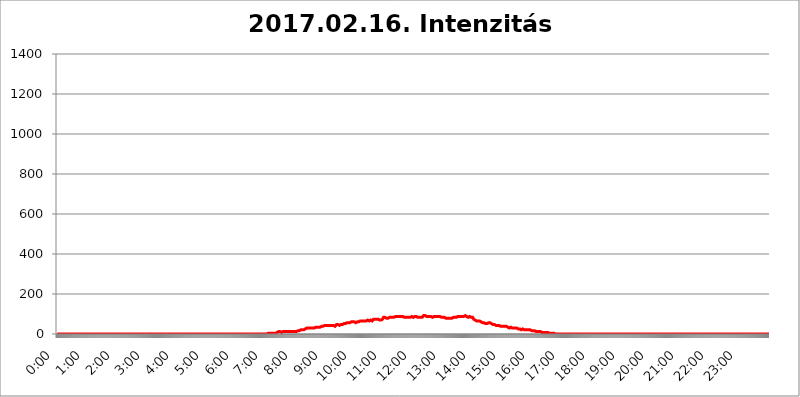
| Category | 2017.02.16. Intenzitás [W/m^2] |
|---|---|
| 0.0 | 0 |
| 0.0006944444444444445 | 0 |
| 0.001388888888888889 | 0 |
| 0.0020833333333333333 | 0 |
| 0.002777777777777778 | 0 |
| 0.003472222222222222 | 0 |
| 0.004166666666666667 | 0 |
| 0.004861111111111111 | 0 |
| 0.005555555555555556 | 0 |
| 0.0062499999999999995 | 0 |
| 0.006944444444444444 | 0 |
| 0.007638888888888889 | 0 |
| 0.008333333333333333 | 0 |
| 0.009027777777777779 | 0 |
| 0.009722222222222222 | 0 |
| 0.010416666666666666 | 0 |
| 0.011111111111111112 | 0 |
| 0.011805555555555555 | 0 |
| 0.012499999999999999 | 0 |
| 0.013194444444444444 | 0 |
| 0.013888888888888888 | 0 |
| 0.014583333333333332 | 0 |
| 0.015277777777777777 | 0 |
| 0.015972222222222224 | 0 |
| 0.016666666666666666 | 0 |
| 0.017361111111111112 | 0 |
| 0.018055555555555557 | 0 |
| 0.01875 | 0 |
| 0.019444444444444445 | 0 |
| 0.02013888888888889 | 0 |
| 0.020833333333333332 | 0 |
| 0.02152777777777778 | 0 |
| 0.022222222222222223 | 0 |
| 0.02291666666666667 | 0 |
| 0.02361111111111111 | 0 |
| 0.024305555555555556 | 0 |
| 0.024999999999999998 | 0 |
| 0.025694444444444447 | 0 |
| 0.02638888888888889 | 0 |
| 0.027083333333333334 | 0 |
| 0.027777777777777776 | 0 |
| 0.02847222222222222 | 0 |
| 0.029166666666666664 | 0 |
| 0.029861111111111113 | 0 |
| 0.030555555555555555 | 0 |
| 0.03125 | 0 |
| 0.03194444444444445 | 0 |
| 0.03263888888888889 | 0 |
| 0.03333333333333333 | 0 |
| 0.034027777777777775 | 0 |
| 0.034722222222222224 | 0 |
| 0.035416666666666666 | 0 |
| 0.036111111111111115 | 0 |
| 0.03680555555555556 | 0 |
| 0.0375 | 0 |
| 0.03819444444444444 | 0 |
| 0.03888888888888889 | 0 |
| 0.03958333333333333 | 0 |
| 0.04027777777777778 | 0 |
| 0.04097222222222222 | 0 |
| 0.041666666666666664 | 0 |
| 0.042361111111111106 | 0 |
| 0.04305555555555556 | 0 |
| 0.043750000000000004 | 0 |
| 0.044444444444444446 | 0 |
| 0.04513888888888889 | 0 |
| 0.04583333333333334 | 0 |
| 0.04652777777777778 | 0 |
| 0.04722222222222222 | 0 |
| 0.04791666666666666 | 0 |
| 0.04861111111111111 | 0 |
| 0.049305555555555554 | 0 |
| 0.049999999999999996 | 0 |
| 0.05069444444444445 | 0 |
| 0.051388888888888894 | 0 |
| 0.052083333333333336 | 0 |
| 0.05277777777777778 | 0 |
| 0.05347222222222222 | 0 |
| 0.05416666666666667 | 0 |
| 0.05486111111111111 | 0 |
| 0.05555555555555555 | 0 |
| 0.05625 | 0 |
| 0.05694444444444444 | 0 |
| 0.057638888888888885 | 0 |
| 0.05833333333333333 | 0 |
| 0.05902777777777778 | 0 |
| 0.059722222222222225 | 0 |
| 0.06041666666666667 | 0 |
| 0.061111111111111116 | 0 |
| 0.06180555555555556 | 0 |
| 0.0625 | 0 |
| 0.06319444444444444 | 0 |
| 0.06388888888888888 | 0 |
| 0.06458333333333334 | 0 |
| 0.06527777777777778 | 0 |
| 0.06597222222222222 | 0 |
| 0.06666666666666667 | 0 |
| 0.06736111111111111 | 0 |
| 0.06805555555555555 | 0 |
| 0.06874999999999999 | 0 |
| 0.06944444444444443 | 0 |
| 0.07013888888888889 | 0 |
| 0.07083333333333333 | 0 |
| 0.07152777777777779 | 0 |
| 0.07222222222222223 | 0 |
| 0.07291666666666667 | 0 |
| 0.07361111111111111 | 0 |
| 0.07430555555555556 | 0 |
| 0.075 | 0 |
| 0.07569444444444444 | 0 |
| 0.0763888888888889 | 0 |
| 0.07708333333333334 | 0 |
| 0.07777777777777778 | 0 |
| 0.07847222222222222 | 0 |
| 0.07916666666666666 | 0 |
| 0.0798611111111111 | 0 |
| 0.08055555555555556 | 0 |
| 0.08125 | 0 |
| 0.08194444444444444 | 0 |
| 0.08263888888888889 | 0 |
| 0.08333333333333333 | 0 |
| 0.08402777777777777 | 0 |
| 0.08472222222222221 | 0 |
| 0.08541666666666665 | 0 |
| 0.08611111111111112 | 0 |
| 0.08680555555555557 | 0 |
| 0.08750000000000001 | 0 |
| 0.08819444444444445 | 0 |
| 0.08888888888888889 | 0 |
| 0.08958333333333333 | 0 |
| 0.09027777777777778 | 0 |
| 0.09097222222222222 | 0 |
| 0.09166666666666667 | 0 |
| 0.09236111111111112 | 0 |
| 0.09305555555555556 | 0 |
| 0.09375 | 0 |
| 0.09444444444444444 | 0 |
| 0.09513888888888888 | 0 |
| 0.09583333333333333 | 0 |
| 0.09652777777777777 | 0 |
| 0.09722222222222222 | 0 |
| 0.09791666666666667 | 0 |
| 0.09861111111111111 | 0 |
| 0.09930555555555555 | 0 |
| 0.09999999999999999 | 0 |
| 0.10069444444444443 | 0 |
| 0.1013888888888889 | 0 |
| 0.10208333333333335 | 0 |
| 0.10277777777777779 | 0 |
| 0.10347222222222223 | 0 |
| 0.10416666666666667 | 0 |
| 0.10486111111111111 | 0 |
| 0.10555555555555556 | 0 |
| 0.10625 | 0 |
| 0.10694444444444444 | 0 |
| 0.1076388888888889 | 0 |
| 0.10833333333333334 | 0 |
| 0.10902777777777778 | 0 |
| 0.10972222222222222 | 0 |
| 0.1111111111111111 | 0 |
| 0.11180555555555556 | 0 |
| 0.11180555555555556 | 0 |
| 0.1125 | 0 |
| 0.11319444444444444 | 0 |
| 0.11388888888888889 | 0 |
| 0.11458333333333333 | 0 |
| 0.11527777777777777 | 0 |
| 0.11597222222222221 | 0 |
| 0.11666666666666665 | 0 |
| 0.1173611111111111 | 0 |
| 0.11805555555555557 | 0 |
| 0.11944444444444445 | 0 |
| 0.12013888888888889 | 0 |
| 0.12083333333333333 | 0 |
| 0.12152777777777778 | 0 |
| 0.12222222222222223 | 0 |
| 0.12291666666666667 | 0 |
| 0.12291666666666667 | 0 |
| 0.12361111111111112 | 0 |
| 0.12430555555555556 | 0 |
| 0.125 | 0 |
| 0.12569444444444444 | 0 |
| 0.12638888888888888 | 0 |
| 0.12708333333333333 | 0 |
| 0.16875 | 0 |
| 0.12847222222222224 | 0 |
| 0.12916666666666668 | 0 |
| 0.12986111111111112 | 0 |
| 0.13055555555555556 | 0 |
| 0.13125 | 0 |
| 0.13194444444444445 | 0 |
| 0.1326388888888889 | 0 |
| 0.13333333333333333 | 0 |
| 0.13402777777777777 | 0 |
| 0.13402777777777777 | 0 |
| 0.13472222222222222 | 0 |
| 0.13541666666666666 | 0 |
| 0.1361111111111111 | 0 |
| 0.13749999999999998 | 0 |
| 0.13819444444444443 | 0 |
| 0.1388888888888889 | 0 |
| 0.13958333333333334 | 0 |
| 0.14027777777777778 | 0 |
| 0.14097222222222222 | 0 |
| 0.14166666666666666 | 0 |
| 0.1423611111111111 | 0 |
| 0.14305555555555557 | 0 |
| 0.14375000000000002 | 0 |
| 0.14444444444444446 | 0 |
| 0.1451388888888889 | 0 |
| 0.1451388888888889 | 0 |
| 0.14652777777777778 | 0 |
| 0.14722222222222223 | 0 |
| 0.14791666666666667 | 0 |
| 0.1486111111111111 | 0 |
| 0.14930555555555555 | 0 |
| 0.15 | 0 |
| 0.15069444444444444 | 0 |
| 0.15138888888888888 | 0 |
| 0.15208333333333332 | 0 |
| 0.15277777777777776 | 0 |
| 0.15347222222222223 | 0 |
| 0.15416666666666667 | 0 |
| 0.15486111111111112 | 0 |
| 0.15555555555555556 | 0 |
| 0.15625 | 0 |
| 0.15694444444444444 | 0 |
| 0.15763888888888888 | 0 |
| 0.15833333333333333 | 0 |
| 0.15902777777777777 | 0 |
| 0.15972222222222224 | 0 |
| 0.16041666666666668 | 0 |
| 0.16111111111111112 | 0 |
| 0.16180555555555556 | 0 |
| 0.1625 | 0 |
| 0.16319444444444445 | 0 |
| 0.1638888888888889 | 0 |
| 0.16458333333333333 | 0 |
| 0.16527777777777777 | 0 |
| 0.16597222222222222 | 0 |
| 0.16666666666666666 | 0 |
| 0.1673611111111111 | 0 |
| 0.16805555555555554 | 0 |
| 0.16874999999999998 | 0 |
| 0.16944444444444443 | 0 |
| 0.17013888888888887 | 0 |
| 0.1708333333333333 | 0 |
| 0.17152777777777775 | 0 |
| 0.17222222222222225 | 0 |
| 0.1729166666666667 | 0 |
| 0.17361111111111113 | 0 |
| 0.17430555555555557 | 0 |
| 0.17500000000000002 | 0 |
| 0.17569444444444446 | 0 |
| 0.1763888888888889 | 0 |
| 0.17708333333333334 | 0 |
| 0.17777777777777778 | 0 |
| 0.17847222222222223 | 0 |
| 0.17916666666666667 | 0 |
| 0.1798611111111111 | 0 |
| 0.18055555555555555 | 0 |
| 0.18125 | 0 |
| 0.18194444444444444 | 0 |
| 0.1826388888888889 | 0 |
| 0.18333333333333335 | 0 |
| 0.1840277777777778 | 0 |
| 0.18472222222222223 | 0 |
| 0.18541666666666667 | 0 |
| 0.18611111111111112 | 0 |
| 0.18680555555555556 | 0 |
| 0.1875 | 0 |
| 0.18819444444444444 | 0 |
| 0.18888888888888888 | 0 |
| 0.18958333333333333 | 0 |
| 0.19027777777777777 | 0 |
| 0.1909722222222222 | 0 |
| 0.19166666666666665 | 0 |
| 0.19236111111111112 | 0 |
| 0.19305555555555554 | 0 |
| 0.19375 | 0 |
| 0.19444444444444445 | 0 |
| 0.1951388888888889 | 0 |
| 0.19583333333333333 | 0 |
| 0.19652777777777777 | 0 |
| 0.19722222222222222 | 0 |
| 0.19791666666666666 | 0 |
| 0.1986111111111111 | 0 |
| 0.19930555555555554 | 0 |
| 0.19999999999999998 | 0 |
| 0.20069444444444443 | 0 |
| 0.20138888888888887 | 0 |
| 0.2020833333333333 | 0 |
| 0.2027777777777778 | 0 |
| 0.2034722222222222 | 0 |
| 0.2041666666666667 | 0 |
| 0.20486111111111113 | 0 |
| 0.20555555555555557 | 0 |
| 0.20625000000000002 | 0 |
| 0.20694444444444446 | 0 |
| 0.2076388888888889 | 0 |
| 0.20833333333333334 | 0 |
| 0.20902777777777778 | 0 |
| 0.20972222222222223 | 0 |
| 0.21041666666666667 | 0 |
| 0.2111111111111111 | 0 |
| 0.21180555555555555 | 0 |
| 0.2125 | 0 |
| 0.21319444444444444 | 0 |
| 0.2138888888888889 | 0 |
| 0.21458333333333335 | 0 |
| 0.2152777777777778 | 0 |
| 0.21597222222222223 | 0 |
| 0.21666666666666667 | 0 |
| 0.21736111111111112 | 0 |
| 0.21805555555555556 | 0 |
| 0.21875 | 0 |
| 0.21944444444444444 | 0 |
| 0.22013888888888888 | 0 |
| 0.22083333333333333 | 0 |
| 0.22152777777777777 | 0 |
| 0.2222222222222222 | 0 |
| 0.22291666666666665 | 0 |
| 0.2236111111111111 | 0 |
| 0.22430555555555556 | 0 |
| 0.225 | 0 |
| 0.22569444444444445 | 0 |
| 0.2263888888888889 | 0 |
| 0.22708333333333333 | 0 |
| 0.22777777777777777 | 0 |
| 0.22847222222222222 | 0 |
| 0.22916666666666666 | 0 |
| 0.2298611111111111 | 0 |
| 0.23055555555555554 | 0 |
| 0.23124999999999998 | 0 |
| 0.23194444444444443 | 0 |
| 0.23263888888888887 | 0 |
| 0.2333333333333333 | 0 |
| 0.2340277777777778 | 0 |
| 0.2347222222222222 | 0 |
| 0.2354166666666667 | 0 |
| 0.23611111111111113 | 0 |
| 0.23680555555555557 | 0 |
| 0.23750000000000002 | 0 |
| 0.23819444444444446 | 0 |
| 0.2388888888888889 | 0 |
| 0.23958333333333334 | 0 |
| 0.24027777777777778 | 0 |
| 0.24097222222222223 | 0 |
| 0.24166666666666667 | 0 |
| 0.2423611111111111 | 0 |
| 0.24305555555555555 | 0 |
| 0.24375 | 0 |
| 0.24444444444444446 | 0 |
| 0.24513888888888888 | 0 |
| 0.24583333333333335 | 0 |
| 0.2465277777777778 | 0 |
| 0.24722222222222223 | 0 |
| 0.24791666666666667 | 0 |
| 0.24861111111111112 | 0 |
| 0.24930555555555556 | 0 |
| 0.25 | 0 |
| 0.25069444444444444 | 0 |
| 0.2513888888888889 | 0 |
| 0.2520833333333333 | 0 |
| 0.25277777777777777 | 0 |
| 0.2534722222222222 | 0 |
| 0.25416666666666665 | 0 |
| 0.2548611111111111 | 0 |
| 0.2555555555555556 | 0 |
| 0.25625000000000003 | 0 |
| 0.2569444444444445 | 0 |
| 0.2576388888888889 | 0 |
| 0.25833333333333336 | 0 |
| 0.2590277777777778 | 0 |
| 0.25972222222222224 | 0 |
| 0.2604166666666667 | 0 |
| 0.2611111111111111 | 0 |
| 0.26180555555555557 | 0 |
| 0.2625 | 0 |
| 0.26319444444444445 | 0 |
| 0.2638888888888889 | 0 |
| 0.26458333333333334 | 0 |
| 0.2652777777777778 | 0 |
| 0.2659722222222222 | 0 |
| 0.26666666666666666 | 0 |
| 0.2673611111111111 | 0 |
| 0.26805555555555555 | 0 |
| 0.26875 | 0 |
| 0.26944444444444443 | 0 |
| 0.2701388888888889 | 0 |
| 0.2708333333333333 | 0 |
| 0.27152777777777776 | 0 |
| 0.2722222222222222 | 0 |
| 0.27291666666666664 | 0 |
| 0.2736111111111111 | 0 |
| 0.2743055555555555 | 0 |
| 0.27499999999999997 | 0 |
| 0.27569444444444446 | 0 |
| 0.27638888888888885 | 0 |
| 0.27708333333333335 | 0 |
| 0.2777777777777778 | 0 |
| 0.27847222222222223 | 0 |
| 0.2791666666666667 | 0 |
| 0.2798611111111111 | 0 |
| 0.28055555555555556 | 0 |
| 0.28125 | 0 |
| 0.28194444444444444 | 0 |
| 0.2826388888888889 | 0 |
| 0.2833333333333333 | 0 |
| 0.28402777777777777 | 0 |
| 0.2847222222222222 | 0 |
| 0.28541666666666665 | 0 |
| 0.28611111111111115 | 0 |
| 0.28680555555555554 | 0 |
| 0.28750000000000003 | 0 |
| 0.2881944444444445 | 0 |
| 0.2888888888888889 | 0 |
| 0.28958333333333336 | 0 |
| 0.2902777777777778 | 0 |
| 0.29097222222222224 | 0 |
| 0.2916666666666667 | 0 |
| 0.2923611111111111 | 0 |
| 0.29305555555555557 | 0 |
| 0.29375 | 0 |
| 0.29444444444444445 | 0 |
| 0.2951388888888889 | 3.525 |
| 0.29583333333333334 | 3.525 |
| 0.2965277777777778 | 3.525 |
| 0.2972222222222222 | 3.525 |
| 0.29791666666666666 | 3.525 |
| 0.2986111111111111 | 3.525 |
| 0.29930555555555555 | 3.525 |
| 0.3 | 3.525 |
| 0.30069444444444443 | 3.525 |
| 0.3013888888888889 | 3.525 |
| 0.3020833333333333 | 3.525 |
| 0.30277777777777776 | 3.525 |
| 0.3034722222222222 | 3.525 |
| 0.30416666666666664 | 3.525 |
| 0.3048611111111111 | 3.525 |
| 0.3055555555555555 | 3.525 |
| 0.30624999999999997 | 3.525 |
| 0.3069444444444444 | 3.525 |
| 0.3076388888888889 | 3.525 |
| 0.30833333333333335 | 7.887 |
| 0.3090277777777778 | 7.887 |
| 0.30972222222222223 | 7.887 |
| 0.3104166666666667 | 12.257 |
| 0.3111111111111111 | 12.257 |
| 0.31180555555555556 | 12.257 |
| 0.3125 | 12.257 |
| 0.31319444444444444 | 12.257 |
| 0.3138888888888889 | 7.887 |
| 0.3145833333333333 | 7.887 |
| 0.31527777777777777 | 12.257 |
| 0.3159722222222222 | 12.257 |
| 0.31666666666666665 | 12.257 |
| 0.31736111111111115 | 12.257 |
| 0.31805555555555554 | 12.257 |
| 0.31875000000000003 | 12.257 |
| 0.3194444444444445 | 12.257 |
| 0.3201388888888889 | 12.257 |
| 0.32083333333333336 | 12.257 |
| 0.3215277777777778 | 12.257 |
| 0.32222222222222224 | 12.257 |
| 0.3229166666666667 | 12.257 |
| 0.3236111111111111 | 12.257 |
| 0.32430555555555557 | 12.257 |
| 0.325 | 12.257 |
| 0.32569444444444445 | 12.257 |
| 0.3263888888888889 | 12.257 |
| 0.32708333333333334 | 12.257 |
| 0.3277777777777778 | 12.257 |
| 0.3284722222222222 | 12.257 |
| 0.32916666666666666 | 12.257 |
| 0.3298611111111111 | 12.257 |
| 0.33055555555555555 | 12.257 |
| 0.33125 | 12.257 |
| 0.33194444444444443 | 12.257 |
| 0.3326388888888889 | 12.257 |
| 0.3333333333333333 | 12.257 |
| 0.3340277777777778 | 12.257 |
| 0.3347222222222222 | 12.257 |
| 0.3354166666666667 | 12.257 |
| 0.3361111111111111 | 16.636 |
| 0.3368055555555556 | 16.636 |
| 0.33749999999999997 | 16.636 |
| 0.33819444444444446 | 16.636 |
| 0.33888888888888885 | 16.636 |
| 0.33958333333333335 | 16.636 |
| 0.34027777777777773 | 16.636 |
| 0.34097222222222223 | 21.024 |
| 0.3416666666666666 | 21.024 |
| 0.3423611111111111 | 21.024 |
| 0.3430555555555555 | 21.024 |
| 0.34375 | 21.024 |
| 0.3444444444444445 | 21.024 |
| 0.3451388888888889 | 21.024 |
| 0.3458333333333334 | 21.024 |
| 0.34652777777777777 | 21.024 |
| 0.34722222222222227 | 21.024 |
| 0.34791666666666665 | 25.419 |
| 0.34861111111111115 | 25.419 |
| 0.34930555555555554 | 25.419 |
| 0.35000000000000003 | 29.823 |
| 0.3506944444444444 | 29.823 |
| 0.3513888888888889 | 29.823 |
| 0.3520833333333333 | 29.823 |
| 0.3527777777777778 | 29.823 |
| 0.3534722222222222 | 29.823 |
| 0.3541666666666667 | 29.823 |
| 0.3548611111111111 | 29.823 |
| 0.35555555555555557 | 29.823 |
| 0.35625 | 29.823 |
| 0.35694444444444445 | 29.823 |
| 0.3576388888888889 | 29.823 |
| 0.35833333333333334 | 29.823 |
| 0.3590277777777778 | 29.823 |
| 0.3597222222222222 | 29.823 |
| 0.36041666666666666 | 29.823 |
| 0.3611111111111111 | 29.823 |
| 0.36180555555555555 | 29.823 |
| 0.3625 | 34.234 |
| 0.36319444444444443 | 29.823 |
| 0.3638888888888889 | 34.234 |
| 0.3645833333333333 | 34.234 |
| 0.3652777777777778 | 34.234 |
| 0.3659722222222222 | 34.234 |
| 0.3666666666666667 | 34.234 |
| 0.3673611111111111 | 34.234 |
| 0.3680555555555556 | 34.234 |
| 0.36874999999999997 | 34.234 |
| 0.36944444444444446 | 34.234 |
| 0.37013888888888885 | 38.653 |
| 0.37083333333333335 | 38.653 |
| 0.37152777777777773 | 38.653 |
| 0.37222222222222223 | 38.653 |
| 0.3729166666666666 | 38.653 |
| 0.3736111111111111 | 38.653 |
| 0.3743055555555555 | 38.653 |
| 0.375 | 43.079 |
| 0.3756944444444445 | 43.079 |
| 0.3763888888888889 | 38.653 |
| 0.3770833333333334 | 43.079 |
| 0.37777777777777777 | 43.079 |
| 0.37847222222222227 | 43.079 |
| 0.37916666666666665 | 43.079 |
| 0.37986111111111115 | 43.079 |
| 0.38055555555555554 | 43.079 |
| 0.38125000000000003 | 43.079 |
| 0.3819444444444444 | 43.079 |
| 0.3826388888888889 | 43.079 |
| 0.3833333333333333 | 43.079 |
| 0.3840277777777778 | 43.079 |
| 0.3847222222222222 | 43.079 |
| 0.3854166666666667 | 43.079 |
| 0.3861111111111111 | 43.079 |
| 0.38680555555555557 | 43.079 |
| 0.3875 | 43.079 |
| 0.38819444444444445 | 43.079 |
| 0.3888888888888889 | 38.653 |
| 0.38958333333333334 | 38.653 |
| 0.3902777777777778 | 38.653 |
| 0.3909722222222222 | 43.079 |
| 0.39166666666666666 | 47.511 |
| 0.3923611111111111 | 43.079 |
| 0.39305555555555555 | 43.079 |
| 0.39375 | 47.511 |
| 0.39444444444444443 | 47.511 |
| 0.3951388888888889 | 47.511 |
| 0.3958333333333333 | 43.079 |
| 0.3965277777777778 | 43.079 |
| 0.3972222222222222 | 47.511 |
| 0.3979166666666667 | 47.511 |
| 0.3986111111111111 | 47.511 |
| 0.3993055555555556 | 47.511 |
| 0.39999999999999997 | 47.511 |
| 0.40069444444444446 | 47.511 |
| 0.40138888888888885 | 47.511 |
| 0.40208333333333335 | 51.951 |
| 0.40277777777777773 | 51.951 |
| 0.40347222222222223 | 51.951 |
| 0.4041666666666666 | 51.951 |
| 0.4048611111111111 | 56.398 |
| 0.4055555555555555 | 56.398 |
| 0.40625 | 56.398 |
| 0.4069444444444445 | 56.398 |
| 0.4076388888888889 | 56.398 |
| 0.4083333333333334 | 56.398 |
| 0.40902777777777777 | 56.398 |
| 0.40972222222222227 | 56.398 |
| 0.41041666666666665 | 56.398 |
| 0.41111111111111115 | 60.85 |
| 0.41180555555555554 | 60.85 |
| 0.41250000000000003 | 60.85 |
| 0.4131944444444444 | 60.85 |
| 0.4138888888888889 | 65.31 |
| 0.4145833333333333 | 60.85 |
| 0.4152777777777778 | 60.85 |
| 0.4159722222222222 | 60.85 |
| 0.4166666666666667 | 60.85 |
| 0.4173611111111111 | 60.85 |
| 0.41805555555555557 | 60.85 |
| 0.41875 | 56.398 |
| 0.41944444444444445 | 60.85 |
| 0.4201388888888889 | 60.85 |
| 0.42083333333333334 | 60.85 |
| 0.4215277777777778 | 65.31 |
| 0.4222222222222222 | 65.31 |
| 0.42291666666666666 | 60.85 |
| 0.4236111111111111 | 65.31 |
| 0.42430555555555555 | 65.31 |
| 0.425 | 65.31 |
| 0.42569444444444443 | 65.31 |
| 0.4263888888888889 | 60.85 |
| 0.4270833333333333 | 65.31 |
| 0.4277777777777778 | 65.31 |
| 0.4284722222222222 | 65.31 |
| 0.4291666666666667 | 65.31 |
| 0.4298611111111111 | 65.31 |
| 0.4305555555555556 | 65.31 |
| 0.43124999999999997 | 65.31 |
| 0.43194444444444446 | 65.31 |
| 0.43263888888888885 | 65.31 |
| 0.43333333333333335 | 65.31 |
| 0.43402777777777773 | 65.31 |
| 0.43472222222222223 | 69.775 |
| 0.4354166666666666 | 69.775 |
| 0.4361111111111111 | 69.775 |
| 0.4368055555555555 | 69.775 |
| 0.4375 | 65.31 |
| 0.4381944444444445 | 69.775 |
| 0.4388888888888889 | 69.775 |
| 0.4395833333333334 | 69.775 |
| 0.44027777777777777 | 65.31 |
| 0.44097222222222227 | 65.31 |
| 0.44166666666666665 | 65.31 |
| 0.44236111111111115 | 69.775 |
| 0.44305555555555554 | 69.775 |
| 0.44375000000000003 | 74.246 |
| 0.4444444444444444 | 74.246 |
| 0.4451388888888889 | 74.246 |
| 0.4458333333333333 | 74.246 |
| 0.4465277777777778 | 78.722 |
| 0.4472222222222222 | 78.722 |
| 0.4479166666666667 | 74.246 |
| 0.4486111111111111 | 74.246 |
| 0.44930555555555557 | 74.246 |
| 0.45 | 74.246 |
| 0.45069444444444445 | 74.246 |
| 0.4513888888888889 | 69.775 |
| 0.45208333333333334 | 69.775 |
| 0.4527777777777778 | 69.775 |
| 0.4534722222222222 | 69.775 |
| 0.45416666666666666 | 69.775 |
| 0.4548611111111111 | 74.246 |
| 0.45555555555555555 | 74.246 |
| 0.45625 | 74.246 |
| 0.45694444444444443 | 78.722 |
| 0.4576388888888889 | 83.205 |
| 0.4583333333333333 | 83.205 |
| 0.4590277777777778 | 83.205 |
| 0.4597222222222222 | 83.205 |
| 0.4604166666666667 | 78.722 |
| 0.4611111111111111 | 78.722 |
| 0.4618055555555556 | 78.722 |
| 0.46249999999999997 | 78.722 |
| 0.46319444444444446 | 78.722 |
| 0.46388888888888885 | 78.722 |
| 0.46458333333333335 | 78.722 |
| 0.46527777777777773 | 83.205 |
| 0.46597222222222223 | 83.205 |
| 0.4666666666666666 | 83.205 |
| 0.4673611111111111 | 83.205 |
| 0.4680555555555555 | 83.205 |
| 0.46875 | 83.205 |
| 0.4694444444444445 | 83.205 |
| 0.4701388888888889 | 83.205 |
| 0.4708333333333334 | 83.205 |
| 0.47152777777777777 | 83.205 |
| 0.47222222222222227 | 83.205 |
| 0.47291666666666665 | 83.205 |
| 0.47361111111111115 | 87.692 |
| 0.47430555555555554 | 87.692 |
| 0.47500000000000003 | 87.692 |
| 0.4756944444444444 | 87.692 |
| 0.4763888888888889 | 87.692 |
| 0.4770833333333333 | 87.692 |
| 0.4777777777777778 | 87.692 |
| 0.4784722222222222 | 87.692 |
| 0.4791666666666667 | 92.184 |
| 0.4798611111111111 | 87.692 |
| 0.48055555555555557 | 87.692 |
| 0.48125 | 87.692 |
| 0.48194444444444445 | 87.692 |
| 0.4826388888888889 | 87.692 |
| 0.48333333333333334 | 87.692 |
| 0.4840277777777778 | 87.692 |
| 0.4847222222222222 | 87.692 |
| 0.48541666666666666 | 87.692 |
| 0.4861111111111111 | 87.692 |
| 0.48680555555555555 | 83.205 |
| 0.4875 | 87.692 |
| 0.48819444444444443 | 83.205 |
| 0.4888888888888889 | 83.205 |
| 0.4895833333333333 | 83.205 |
| 0.4902777777777778 | 83.205 |
| 0.4909722222222222 | 83.205 |
| 0.4916666666666667 | 83.205 |
| 0.4923611111111111 | 83.205 |
| 0.4930555555555556 | 83.205 |
| 0.49374999999999997 | 83.205 |
| 0.49444444444444446 | 83.205 |
| 0.49513888888888885 | 83.205 |
| 0.49583333333333335 | 83.205 |
| 0.49652777777777773 | 83.205 |
| 0.49722222222222223 | 87.692 |
| 0.4979166666666666 | 87.692 |
| 0.4986111111111111 | 87.692 |
| 0.4993055555555555 | 83.205 |
| 0.5 | 83.205 |
| 0.5006944444444444 | 87.692 |
| 0.5013888888888889 | 87.692 |
| 0.5020833333333333 | 83.205 |
| 0.5027777777777778 | 83.205 |
| 0.5034722222222222 | 87.692 |
| 0.5041666666666667 | 87.692 |
| 0.5048611111111111 | 83.205 |
| 0.5055555555555555 | 83.205 |
| 0.50625 | 83.205 |
| 0.5069444444444444 | 87.692 |
| 0.5076388888888889 | 83.205 |
| 0.5083333333333333 | 83.205 |
| 0.5090277777777777 | 83.205 |
| 0.5097222222222222 | 83.205 |
| 0.5104166666666666 | 83.205 |
| 0.5111111111111112 | 83.205 |
| 0.5118055555555555 | 83.205 |
| 0.5125000000000001 | 87.692 |
| 0.5131944444444444 | 87.692 |
| 0.513888888888889 | 92.184 |
| 0.5145833333333333 | 87.692 |
| 0.5152777777777778 | 92.184 |
| 0.5159722222222222 | 92.184 |
| 0.5166666666666667 | 92.184 |
| 0.517361111111111 | 87.692 |
| 0.5180555555555556 | 87.692 |
| 0.5187499999999999 | 92.184 |
| 0.5194444444444445 | 92.184 |
| 0.5201388888888888 | 87.692 |
| 0.5208333333333334 | 87.692 |
| 0.5215277777777778 | 87.692 |
| 0.5222222222222223 | 87.692 |
| 0.5229166666666667 | 87.692 |
| 0.5236111111111111 | 87.692 |
| 0.5243055555555556 | 87.692 |
| 0.525 | 87.692 |
| 0.5256944444444445 | 87.692 |
| 0.5263888888888889 | 83.205 |
| 0.5270833333333333 | 87.692 |
| 0.5277777777777778 | 87.692 |
| 0.5284722222222222 | 87.692 |
| 0.5291666666666667 | 83.205 |
| 0.5298611111111111 | 83.205 |
| 0.5305555555555556 | 87.692 |
| 0.53125 | 87.692 |
| 0.5319444444444444 | 87.692 |
| 0.5326388888888889 | 87.692 |
| 0.5333333333333333 | 87.692 |
| 0.5340277777777778 | 87.692 |
| 0.5347222222222222 | 87.692 |
| 0.5354166666666667 | 87.692 |
| 0.5361111111111111 | 87.692 |
| 0.5368055555555555 | 87.692 |
| 0.5375 | 83.205 |
| 0.5381944444444444 | 83.205 |
| 0.5388888888888889 | 83.205 |
| 0.5395833333333333 | 83.205 |
| 0.5402777777777777 | 83.205 |
| 0.5409722222222222 | 83.205 |
| 0.5416666666666666 | 83.205 |
| 0.5423611111111112 | 83.205 |
| 0.5430555555555555 | 83.205 |
| 0.5437500000000001 | 83.205 |
| 0.5444444444444444 | 83.205 |
| 0.545138888888889 | 78.722 |
| 0.5458333333333333 | 83.205 |
| 0.5465277777777778 | 78.722 |
| 0.5472222222222222 | 78.722 |
| 0.5479166666666667 | 83.205 |
| 0.548611111111111 | 78.722 |
| 0.5493055555555556 | 78.722 |
| 0.5499999999999999 | 78.722 |
| 0.5506944444444445 | 78.722 |
| 0.5513888888888888 | 78.722 |
| 0.5520833333333334 | 78.722 |
| 0.5527777777777778 | 78.722 |
| 0.5534722222222223 | 78.722 |
| 0.5541666666666667 | 83.205 |
| 0.5548611111111111 | 83.205 |
| 0.5555555555555556 | 83.205 |
| 0.55625 | 83.205 |
| 0.5569444444444445 | 83.205 |
| 0.5576388888888889 | 83.205 |
| 0.5583333333333333 | 83.205 |
| 0.5590277777777778 | 87.692 |
| 0.5597222222222222 | 83.205 |
| 0.5604166666666667 | 83.205 |
| 0.5611111111111111 | 87.692 |
| 0.5618055555555556 | 87.692 |
| 0.5625 | 83.205 |
| 0.5631944444444444 | 83.205 |
| 0.5638888888888889 | 87.692 |
| 0.5645833333333333 | 87.692 |
| 0.5652777777777778 | 87.692 |
| 0.5659722222222222 | 87.692 |
| 0.5666666666666667 | 87.692 |
| 0.5673611111111111 | 87.692 |
| 0.5680555555555555 | 87.692 |
| 0.56875 | 87.692 |
| 0.5694444444444444 | 87.692 |
| 0.5701388888888889 | 87.692 |
| 0.5708333333333333 | 87.692 |
| 0.5715277777777777 | 87.692 |
| 0.5722222222222222 | 92.184 |
| 0.5729166666666666 | 87.692 |
| 0.5736111111111112 | 87.692 |
| 0.5743055555555555 | 87.692 |
| 0.5750000000000001 | 87.692 |
| 0.5756944444444444 | 87.692 |
| 0.576388888888889 | 83.205 |
| 0.5770833333333333 | 83.205 |
| 0.5777777777777778 | 87.692 |
| 0.5784722222222222 | 87.692 |
| 0.5791666666666667 | 87.692 |
| 0.579861111111111 | 83.205 |
| 0.5805555555555556 | 83.205 |
| 0.5812499999999999 | 83.205 |
| 0.5819444444444445 | 83.205 |
| 0.5826388888888888 | 83.205 |
| 0.5833333333333334 | 78.722 |
| 0.5840277777777778 | 74.246 |
| 0.5847222222222223 | 74.246 |
| 0.5854166666666667 | 74.246 |
| 0.5861111111111111 | 69.775 |
| 0.5868055555555556 | 69.775 |
| 0.5875 | 69.775 |
| 0.5881944444444445 | 65.31 |
| 0.5888888888888889 | 65.31 |
| 0.5895833333333333 | 65.31 |
| 0.5902777777777778 | 65.31 |
| 0.5909722222222222 | 65.31 |
| 0.5916666666666667 | 65.31 |
| 0.5923611111111111 | 65.31 |
| 0.5930555555555556 | 65.31 |
| 0.59375 | 60.85 |
| 0.5944444444444444 | 60.85 |
| 0.5951388888888889 | 65.31 |
| 0.5958333333333333 | 60.85 |
| 0.5965277777777778 | 56.398 |
| 0.5972222222222222 | 56.398 |
| 0.5979166666666667 | 56.398 |
| 0.5986111111111111 | 56.398 |
| 0.5993055555555555 | 56.398 |
| 0.6 | 51.951 |
| 0.6006944444444444 | 51.951 |
| 0.6013888888888889 | 51.951 |
| 0.6020833333333333 | 51.951 |
| 0.6027777777777777 | 51.951 |
| 0.6034722222222222 | 51.951 |
| 0.6041666666666666 | 51.951 |
| 0.6048611111111112 | 56.398 |
| 0.6055555555555555 | 56.398 |
| 0.6062500000000001 | 56.398 |
| 0.6069444444444444 | 56.398 |
| 0.607638888888889 | 56.398 |
| 0.6083333333333333 | 51.951 |
| 0.6090277777777778 | 51.951 |
| 0.6097222222222222 | 51.951 |
| 0.6104166666666667 | 47.511 |
| 0.611111111111111 | 47.511 |
| 0.6118055555555556 | 47.511 |
| 0.6124999999999999 | 47.511 |
| 0.6131944444444445 | 47.511 |
| 0.6138888888888888 | 47.511 |
| 0.6145833333333334 | 47.511 |
| 0.6152777777777778 | 43.079 |
| 0.6159722222222223 | 43.079 |
| 0.6166666666666667 | 43.079 |
| 0.6173611111111111 | 43.079 |
| 0.6180555555555556 | 43.079 |
| 0.61875 | 43.079 |
| 0.6194444444444445 | 43.079 |
| 0.6201388888888889 | 43.079 |
| 0.6208333333333333 | 38.653 |
| 0.6215277777777778 | 38.653 |
| 0.6222222222222222 | 38.653 |
| 0.6229166666666667 | 38.653 |
| 0.6236111111111111 | 38.653 |
| 0.6243055555555556 | 38.653 |
| 0.625 | 38.653 |
| 0.6256944444444444 | 38.653 |
| 0.6263888888888889 | 38.653 |
| 0.6270833333333333 | 38.653 |
| 0.6277777777777778 | 38.653 |
| 0.6284722222222222 | 38.653 |
| 0.6291666666666667 | 38.653 |
| 0.6298611111111111 | 38.653 |
| 0.6305555555555555 | 38.653 |
| 0.63125 | 34.234 |
| 0.6319444444444444 | 34.234 |
| 0.6326388888888889 | 29.823 |
| 0.6333333333333333 | 29.823 |
| 0.6340277777777777 | 29.823 |
| 0.6347222222222222 | 29.823 |
| 0.6354166666666666 | 34.234 |
| 0.6361111111111112 | 34.234 |
| 0.6368055555555555 | 34.234 |
| 0.6375000000000001 | 29.823 |
| 0.6381944444444444 | 29.823 |
| 0.638888888888889 | 29.823 |
| 0.6395833333333333 | 29.823 |
| 0.6402777777777778 | 29.823 |
| 0.6409722222222222 | 29.823 |
| 0.6416666666666667 | 29.823 |
| 0.642361111111111 | 29.823 |
| 0.6430555555555556 | 29.823 |
| 0.6437499999999999 | 29.823 |
| 0.6444444444444445 | 29.823 |
| 0.6451388888888888 | 29.823 |
| 0.6458333333333334 | 25.419 |
| 0.6465277777777778 | 25.419 |
| 0.6472222222222223 | 25.419 |
| 0.6479166666666667 | 25.419 |
| 0.6486111111111111 | 25.419 |
| 0.6493055555555556 | 25.419 |
| 0.65 | 25.419 |
| 0.6506944444444445 | 21.024 |
| 0.6513888888888889 | 25.419 |
| 0.6520833333333333 | 21.024 |
| 0.6527777777777778 | 25.419 |
| 0.6534722222222222 | 21.024 |
| 0.6541666666666667 | 21.024 |
| 0.6548611111111111 | 21.024 |
| 0.6555555555555556 | 21.024 |
| 0.65625 | 21.024 |
| 0.6569444444444444 | 21.024 |
| 0.6576388888888889 | 21.024 |
| 0.6583333333333333 | 21.024 |
| 0.6590277777777778 | 21.024 |
| 0.6597222222222222 | 21.024 |
| 0.6604166666666667 | 21.024 |
| 0.6611111111111111 | 21.024 |
| 0.6618055555555555 | 21.024 |
| 0.6625 | 21.024 |
| 0.6631944444444444 | 21.024 |
| 0.6638888888888889 | 21.024 |
| 0.6645833333333333 | 21.024 |
| 0.6652777777777777 | 16.636 |
| 0.6659722222222222 | 16.636 |
| 0.6666666666666666 | 16.636 |
| 0.6673611111111111 | 16.636 |
| 0.6680555555555556 | 16.636 |
| 0.6687500000000001 | 16.636 |
| 0.6694444444444444 | 16.636 |
| 0.6701388888888888 | 16.636 |
| 0.6708333333333334 | 16.636 |
| 0.6715277777777778 | 12.257 |
| 0.6722222222222222 | 12.257 |
| 0.6729166666666666 | 12.257 |
| 0.6736111111111112 | 12.257 |
| 0.6743055555555556 | 12.257 |
| 0.6749999999999999 | 12.257 |
| 0.6756944444444444 | 12.257 |
| 0.6763888888888889 | 12.257 |
| 0.6770833333333334 | 12.257 |
| 0.6777777777777777 | 12.257 |
| 0.6784722222222223 | 12.257 |
| 0.6791666666666667 | 12.257 |
| 0.6798611111111111 | 7.887 |
| 0.6805555555555555 | 7.887 |
| 0.68125 | 7.887 |
| 0.6819444444444445 | 7.887 |
| 0.6826388888888889 | 7.887 |
| 0.6833333333333332 | 7.887 |
| 0.6840277777777778 | 7.887 |
| 0.6847222222222222 | 7.887 |
| 0.6854166666666667 | 7.887 |
| 0.686111111111111 | 7.887 |
| 0.6868055555555556 | 7.887 |
| 0.6875 | 7.887 |
| 0.6881944444444444 | 7.887 |
| 0.688888888888889 | 3.525 |
| 0.6895833333333333 | 3.525 |
| 0.6902777777777778 | 3.525 |
| 0.6909722222222222 | 3.525 |
| 0.6916666666666668 | 3.525 |
| 0.6923611111111111 | 3.525 |
| 0.6930555555555555 | 3.525 |
| 0.69375 | 3.525 |
| 0.6944444444444445 | 3.525 |
| 0.6951388888888889 | 3.525 |
| 0.6958333333333333 | 3.525 |
| 0.6965277777777777 | 3.525 |
| 0.6972222222222223 | 3.525 |
| 0.6979166666666666 | 0 |
| 0.6986111111111111 | 0 |
| 0.6993055555555556 | 0 |
| 0.7000000000000001 | 0 |
| 0.7006944444444444 | 0 |
| 0.7013888888888888 | 0 |
| 0.7020833333333334 | 0 |
| 0.7027777777777778 | 0 |
| 0.7034722222222222 | 0 |
| 0.7041666666666666 | 0 |
| 0.7048611111111112 | 0 |
| 0.7055555555555556 | 0 |
| 0.7062499999999999 | 0 |
| 0.7069444444444444 | 0 |
| 0.7076388888888889 | 0 |
| 0.7083333333333334 | 0 |
| 0.7090277777777777 | 0 |
| 0.7097222222222223 | 0 |
| 0.7104166666666667 | 0 |
| 0.7111111111111111 | 0 |
| 0.7118055555555555 | 0 |
| 0.7125 | 0 |
| 0.7131944444444445 | 0 |
| 0.7138888888888889 | 0 |
| 0.7145833333333332 | 0 |
| 0.7152777777777778 | 0 |
| 0.7159722222222222 | 0 |
| 0.7166666666666667 | 0 |
| 0.717361111111111 | 0 |
| 0.7180555555555556 | 0 |
| 0.71875 | 0 |
| 0.7194444444444444 | 0 |
| 0.720138888888889 | 0 |
| 0.7208333333333333 | 0 |
| 0.7215277777777778 | 0 |
| 0.7222222222222222 | 0 |
| 0.7229166666666668 | 0 |
| 0.7236111111111111 | 0 |
| 0.7243055555555555 | 0 |
| 0.725 | 0 |
| 0.7256944444444445 | 0 |
| 0.7263888888888889 | 0 |
| 0.7270833333333333 | 0 |
| 0.7277777777777777 | 0 |
| 0.7284722222222223 | 0 |
| 0.7291666666666666 | 0 |
| 0.7298611111111111 | 0 |
| 0.7305555555555556 | 0 |
| 0.7312500000000001 | 0 |
| 0.7319444444444444 | 0 |
| 0.7326388888888888 | 0 |
| 0.7333333333333334 | 0 |
| 0.7340277777777778 | 0 |
| 0.7347222222222222 | 0 |
| 0.7354166666666666 | 0 |
| 0.7361111111111112 | 0 |
| 0.7368055555555556 | 0 |
| 0.7374999999999999 | 0 |
| 0.7381944444444444 | 0 |
| 0.7388888888888889 | 0 |
| 0.7395833333333334 | 0 |
| 0.7402777777777777 | 0 |
| 0.7409722222222223 | 0 |
| 0.7416666666666667 | 0 |
| 0.7423611111111111 | 0 |
| 0.7430555555555555 | 0 |
| 0.74375 | 0 |
| 0.7444444444444445 | 0 |
| 0.7451388888888889 | 0 |
| 0.7458333333333332 | 0 |
| 0.7465277777777778 | 0 |
| 0.7472222222222222 | 0 |
| 0.7479166666666667 | 0 |
| 0.748611111111111 | 0 |
| 0.7493055555555556 | 0 |
| 0.75 | 0 |
| 0.7506944444444444 | 0 |
| 0.751388888888889 | 0 |
| 0.7520833333333333 | 0 |
| 0.7527777777777778 | 0 |
| 0.7534722222222222 | 0 |
| 0.7541666666666668 | 0 |
| 0.7548611111111111 | 0 |
| 0.7555555555555555 | 0 |
| 0.75625 | 0 |
| 0.7569444444444445 | 0 |
| 0.7576388888888889 | 0 |
| 0.7583333333333333 | 0 |
| 0.7590277777777777 | 0 |
| 0.7597222222222223 | 0 |
| 0.7604166666666666 | 0 |
| 0.7611111111111111 | 0 |
| 0.7618055555555556 | 0 |
| 0.7625000000000001 | 0 |
| 0.7631944444444444 | 0 |
| 0.7638888888888888 | 0 |
| 0.7645833333333334 | 0 |
| 0.7652777777777778 | 0 |
| 0.7659722222222222 | 0 |
| 0.7666666666666666 | 0 |
| 0.7673611111111112 | 0 |
| 0.7680555555555556 | 0 |
| 0.7687499999999999 | 0 |
| 0.7694444444444444 | 0 |
| 0.7701388888888889 | 0 |
| 0.7708333333333334 | 0 |
| 0.7715277777777777 | 0 |
| 0.7722222222222223 | 0 |
| 0.7729166666666667 | 0 |
| 0.7736111111111111 | 0 |
| 0.7743055555555555 | 0 |
| 0.775 | 0 |
| 0.7756944444444445 | 0 |
| 0.7763888888888889 | 0 |
| 0.7770833333333332 | 0 |
| 0.7777777777777778 | 0 |
| 0.7784722222222222 | 0 |
| 0.7791666666666667 | 0 |
| 0.779861111111111 | 0 |
| 0.7805555555555556 | 0 |
| 0.78125 | 0 |
| 0.7819444444444444 | 0 |
| 0.782638888888889 | 0 |
| 0.7833333333333333 | 0 |
| 0.7840277777777778 | 0 |
| 0.7847222222222222 | 0 |
| 0.7854166666666668 | 0 |
| 0.7861111111111111 | 0 |
| 0.7868055555555555 | 0 |
| 0.7875 | 0 |
| 0.7881944444444445 | 0 |
| 0.7888888888888889 | 0 |
| 0.7895833333333333 | 0 |
| 0.7902777777777777 | 0 |
| 0.7909722222222223 | 0 |
| 0.7916666666666666 | 0 |
| 0.7923611111111111 | 0 |
| 0.7930555555555556 | 0 |
| 0.7937500000000001 | 0 |
| 0.7944444444444444 | 0 |
| 0.7951388888888888 | 0 |
| 0.7958333333333334 | 0 |
| 0.7965277777777778 | 0 |
| 0.7972222222222222 | 0 |
| 0.7979166666666666 | 0 |
| 0.7986111111111112 | 0 |
| 0.7993055555555556 | 0 |
| 0.7999999999999999 | 0 |
| 0.8006944444444444 | 0 |
| 0.8013888888888889 | 0 |
| 0.8020833333333334 | 0 |
| 0.8027777777777777 | 0 |
| 0.8034722222222223 | 0 |
| 0.8041666666666667 | 0 |
| 0.8048611111111111 | 0 |
| 0.8055555555555555 | 0 |
| 0.80625 | 0 |
| 0.8069444444444445 | 0 |
| 0.8076388888888889 | 0 |
| 0.8083333333333332 | 0 |
| 0.8090277777777778 | 0 |
| 0.8097222222222222 | 0 |
| 0.8104166666666667 | 0 |
| 0.811111111111111 | 0 |
| 0.8118055555555556 | 0 |
| 0.8125 | 0 |
| 0.8131944444444444 | 0 |
| 0.813888888888889 | 0 |
| 0.8145833333333333 | 0 |
| 0.8152777777777778 | 0 |
| 0.8159722222222222 | 0 |
| 0.8166666666666668 | 0 |
| 0.8173611111111111 | 0 |
| 0.8180555555555555 | 0 |
| 0.81875 | 0 |
| 0.8194444444444445 | 0 |
| 0.8201388888888889 | 0 |
| 0.8208333333333333 | 0 |
| 0.8215277777777777 | 0 |
| 0.8222222222222223 | 0 |
| 0.8229166666666666 | 0 |
| 0.8236111111111111 | 0 |
| 0.8243055555555556 | 0 |
| 0.8250000000000001 | 0 |
| 0.8256944444444444 | 0 |
| 0.8263888888888888 | 0 |
| 0.8270833333333334 | 0 |
| 0.8277777777777778 | 0 |
| 0.8284722222222222 | 0 |
| 0.8291666666666666 | 0 |
| 0.8298611111111112 | 0 |
| 0.8305555555555556 | 0 |
| 0.8312499999999999 | 0 |
| 0.8319444444444444 | 0 |
| 0.8326388888888889 | 0 |
| 0.8333333333333334 | 0 |
| 0.8340277777777777 | 0 |
| 0.8347222222222223 | 0 |
| 0.8354166666666667 | 0 |
| 0.8361111111111111 | 0 |
| 0.8368055555555555 | 0 |
| 0.8375 | 0 |
| 0.8381944444444445 | 0 |
| 0.8388888888888889 | 0 |
| 0.8395833333333332 | 0 |
| 0.8402777777777778 | 0 |
| 0.8409722222222222 | 0 |
| 0.8416666666666667 | 0 |
| 0.842361111111111 | 0 |
| 0.8430555555555556 | 0 |
| 0.84375 | 0 |
| 0.8444444444444444 | 0 |
| 0.845138888888889 | 0 |
| 0.8458333333333333 | 0 |
| 0.8465277777777778 | 0 |
| 0.8472222222222222 | 0 |
| 0.8479166666666668 | 0 |
| 0.8486111111111111 | 0 |
| 0.8493055555555555 | 0 |
| 0.85 | 0 |
| 0.8506944444444445 | 0 |
| 0.8513888888888889 | 0 |
| 0.8520833333333333 | 0 |
| 0.8527777777777777 | 0 |
| 0.8534722222222223 | 0 |
| 0.8541666666666666 | 0 |
| 0.8548611111111111 | 0 |
| 0.8555555555555556 | 0 |
| 0.8562500000000001 | 0 |
| 0.8569444444444444 | 0 |
| 0.8576388888888888 | 0 |
| 0.8583333333333334 | 0 |
| 0.8590277777777778 | 0 |
| 0.8597222222222222 | 0 |
| 0.8604166666666666 | 0 |
| 0.8611111111111112 | 0 |
| 0.8618055555555556 | 0 |
| 0.8624999999999999 | 0 |
| 0.8631944444444444 | 0 |
| 0.8638888888888889 | 0 |
| 0.8645833333333334 | 0 |
| 0.8652777777777777 | 0 |
| 0.8659722222222223 | 0 |
| 0.8666666666666667 | 0 |
| 0.8673611111111111 | 0 |
| 0.8680555555555555 | 0 |
| 0.86875 | 0 |
| 0.8694444444444445 | 0 |
| 0.8701388888888889 | 0 |
| 0.8708333333333332 | 0 |
| 0.8715277777777778 | 0 |
| 0.8722222222222222 | 0 |
| 0.8729166666666667 | 0 |
| 0.873611111111111 | 0 |
| 0.8743055555555556 | 0 |
| 0.875 | 0 |
| 0.8756944444444444 | 0 |
| 0.876388888888889 | 0 |
| 0.8770833333333333 | 0 |
| 0.8777777777777778 | 0 |
| 0.8784722222222222 | 0 |
| 0.8791666666666668 | 0 |
| 0.8798611111111111 | 0 |
| 0.8805555555555555 | 0 |
| 0.88125 | 0 |
| 0.8819444444444445 | 0 |
| 0.8826388888888889 | 0 |
| 0.8833333333333333 | 0 |
| 0.8840277777777777 | 0 |
| 0.8847222222222223 | 0 |
| 0.8854166666666666 | 0 |
| 0.8861111111111111 | 0 |
| 0.8868055555555556 | 0 |
| 0.8875000000000001 | 0 |
| 0.8881944444444444 | 0 |
| 0.8888888888888888 | 0 |
| 0.8895833333333334 | 0 |
| 0.8902777777777778 | 0 |
| 0.8909722222222222 | 0 |
| 0.8916666666666666 | 0 |
| 0.8923611111111112 | 0 |
| 0.8930555555555556 | 0 |
| 0.8937499999999999 | 0 |
| 0.8944444444444444 | 0 |
| 0.8951388888888889 | 0 |
| 0.8958333333333334 | 0 |
| 0.8965277777777777 | 0 |
| 0.8972222222222223 | 0 |
| 0.8979166666666667 | 0 |
| 0.8986111111111111 | 0 |
| 0.8993055555555555 | 0 |
| 0.9 | 0 |
| 0.9006944444444445 | 0 |
| 0.9013888888888889 | 0 |
| 0.9020833333333332 | 0 |
| 0.9027777777777778 | 0 |
| 0.9034722222222222 | 0 |
| 0.9041666666666667 | 0 |
| 0.904861111111111 | 0 |
| 0.9055555555555556 | 0 |
| 0.90625 | 0 |
| 0.9069444444444444 | 0 |
| 0.907638888888889 | 0 |
| 0.9083333333333333 | 0 |
| 0.9090277777777778 | 0 |
| 0.9097222222222222 | 0 |
| 0.9104166666666668 | 0 |
| 0.9111111111111111 | 0 |
| 0.9118055555555555 | 0 |
| 0.9125 | 0 |
| 0.9131944444444445 | 0 |
| 0.9138888888888889 | 0 |
| 0.9145833333333333 | 0 |
| 0.9152777777777777 | 0 |
| 0.9159722222222223 | 0 |
| 0.9166666666666666 | 0 |
| 0.9173611111111111 | 0 |
| 0.9180555555555556 | 0 |
| 0.9187500000000001 | 0 |
| 0.9194444444444444 | 0 |
| 0.9201388888888888 | 0 |
| 0.9208333333333334 | 0 |
| 0.9215277777777778 | 0 |
| 0.9222222222222222 | 0 |
| 0.9229166666666666 | 0 |
| 0.9236111111111112 | 0 |
| 0.9243055555555556 | 0 |
| 0.9249999999999999 | 0 |
| 0.9256944444444444 | 0 |
| 0.9263888888888889 | 0 |
| 0.9270833333333334 | 0 |
| 0.9277777777777777 | 0 |
| 0.9284722222222223 | 0 |
| 0.9291666666666667 | 0 |
| 0.9298611111111111 | 0 |
| 0.9305555555555555 | 0 |
| 0.93125 | 0 |
| 0.9319444444444445 | 0 |
| 0.9326388888888889 | 0 |
| 0.9333333333333332 | 0 |
| 0.9340277777777778 | 0 |
| 0.9347222222222222 | 0 |
| 0.9354166666666667 | 0 |
| 0.936111111111111 | 0 |
| 0.9368055555555556 | 0 |
| 0.9375 | 0 |
| 0.9381944444444444 | 0 |
| 0.938888888888889 | 0 |
| 0.9395833333333333 | 0 |
| 0.9402777777777778 | 0 |
| 0.9409722222222222 | 0 |
| 0.9416666666666668 | 0 |
| 0.9423611111111111 | 0 |
| 0.9430555555555555 | 0 |
| 0.94375 | 0 |
| 0.9444444444444445 | 0 |
| 0.9451388888888889 | 0 |
| 0.9458333333333333 | 0 |
| 0.9465277777777777 | 0 |
| 0.9472222222222223 | 0 |
| 0.9479166666666666 | 0 |
| 0.9486111111111111 | 0 |
| 0.9493055555555556 | 0 |
| 0.9500000000000001 | 0 |
| 0.9506944444444444 | 0 |
| 0.9513888888888888 | 0 |
| 0.9520833333333334 | 0 |
| 0.9527777777777778 | 0 |
| 0.9534722222222222 | 0 |
| 0.9541666666666666 | 0 |
| 0.9548611111111112 | 0 |
| 0.9555555555555556 | 0 |
| 0.9562499999999999 | 0 |
| 0.9569444444444444 | 0 |
| 0.9576388888888889 | 0 |
| 0.9583333333333334 | 0 |
| 0.9590277777777777 | 0 |
| 0.9597222222222223 | 0 |
| 0.9604166666666667 | 0 |
| 0.9611111111111111 | 0 |
| 0.9618055555555555 | 0 |
| 0.9625 | 0 |
| 0.9631944444444445 | 0 |
| 0.9638888888888889 | 0 |
| 0.9645833333333332 | 0 |
| 0.9652777777777778 | 0 |
| 0.9659722222222222 | 0 |
| 0.9666666666666667 | 0 |
| 0.967361111111111 | 0 |
| 0.9680555555555556 | 0 |
| 0.96875 | 0 |
| 0.9694444444444444 | 0 |
| 0.970138888888889 | 0 |
| 0.9708333333333333 | 0 |
| 0.9715277777777778 | 0 |
| 0.9722222222222222 | 0 |
| 0.9729166666666668 | 0 |
| 0.9736111111111111 | 0 |
| 0.9743055555555555 | 0 |
| 0.975 | 0 |
| 0.9756944444444445 | 0 |
| 0.9763888888888889 | 0 |
| 0.9770833333333333 | 0 |
| 0.9777777777777777 | 0 |
| 0.9784722222222223 | 0 |
| 0.9791666666666666 | 0 |
| 0.9798611111111111 | 0 |
| 0.9805555555555556 | 0 |
| 0.9812500000000001 | 0 |
| 0.9819444444444444 | 0 |
| 0.9826388888888888 | 0 |
| 0.9833333333333334 | 0 |
| 0.9840277777777778 | 0 |
| 0.9847222222222222 | 0 |
| 0.9854166666666666 | 0 |
| 0.9861111111111112 | 0 |
| 0.9868055555555556 | 0 |
| 0.9874999999999999 | 0 |
| 0.9881944444444444 | 0 |
| 0.9888888888888889 | 0 |
| 0.9895833333333334 | 0 |
| 0.9902777777777777 | 0 |
| 0.9909722222222223 | 0 |
| 0.9916666666666667 | 0 |
| 0.9923611111111111 | 0 |
| 0.9930555555555555 | 0 |
| 0.99375 | 0 |
| 0.9944444444444445 | 0 |
| 0.9951388888888889 | 0 |
| 0.9958333333333332 | 0 |
| 0.9965277777777778 | 0 |
| 0.9972222222222222 | 0 |
| 0.9979166666666667 | 0 |
| 0.998611111111111 | 0 |
| 0.9993055555555556 | 0 |